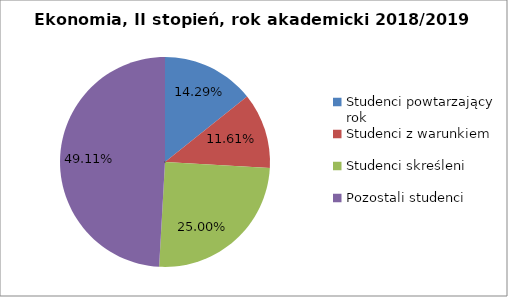
| Category | Series 0 |
|---|---|
| Studenci powtarzający rok | 16 |
| Studenci z warunkiem | 13 |
| Studenci skreśleni | 28 |
| Pozostali studenci | 55 |